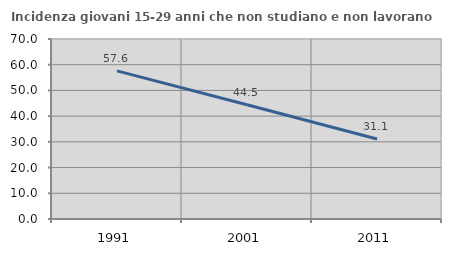
| Category | Incidenza giovani 15-29 anni che non studiano e non lavorano  |
|---|---|
| 1991.0 | 57.619 |
| 2001.0 | 44.459 |
| 2011.0 | 31.085 |